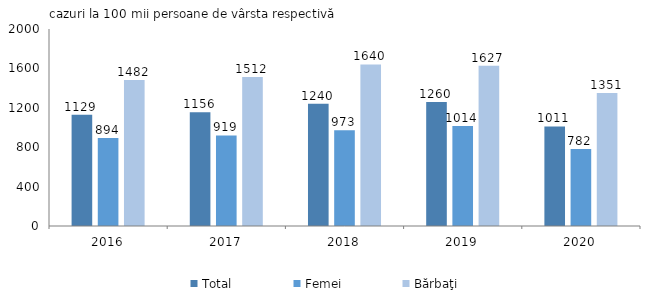
| Category | Total | Femei | Bărbaţi |
|---|---|---|---|
| 2016.0 | 1129 | 894 | 1482 |
| 2017.0 | 1156 | 919 | 1512 |
| 2018.0 | 1240 | 973 | 1640 |
| 2019.0 | 1260 | 1014 | 1627 |
| 2020.0 | 1011 | 782 | 1351 |